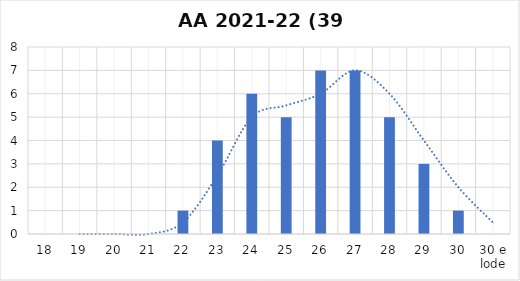
| Category | Series 0 |
|---|---|
| 18 | 0 |
| 19 | 0 |
| 20 | 0 |
| 21 | 0 |
| 22 | 1 |
| 23 | 4 |
| 24 | 6 |
| 25 | 5 |
| 26 | 7 |
| 27 | 7 |
| 28 | 5 |
| 29 | 3 |
| 30 | 1 |
| 30 e lode | 0 |